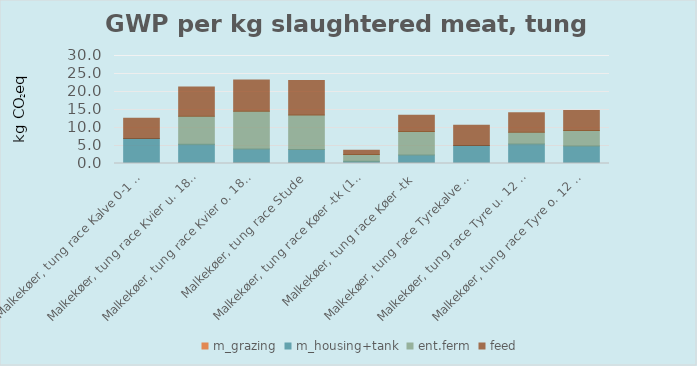
| Category | m_grazing | m_housing+tank | ent.ferm | feed |
|---|---|---|---|---|
| Malkekøer, tung race Kalve 0-1 mdr | 0 | 6.938 | 0 | 5.622 |
| Malkekøer, tung race Kvier u. 18. mdr. | 0.172 | 5.205 | 7.73 | 8.114 |
| Malkekøer, tung race Kvier o. 18. mdr. | 0.153 | 3.892 | 10.476 | 8.669 |
| Malkekøer, tung race Stude | 0.147 | 3.761 | 9.571 | 9.557 |
| Malkekøer, tung race Køer -tk (1year) | 0.014 | 0.631 | 1.823 | 1.22 |
| Malkekøer, tung race Køer -tk | 0.058 | 2.287 | 6.521 | 4.545 |
| Malkekøer, tung race Tyrekalve 0-1 mdr. | 0 | 4.997 | 0 | 5.622 |
| Malkekøer, tung race Tyre u. 12 mdr. | 0 | 5.433 | 3.281 | 5.397 |
| Malkekøer, tung race Tyre o. 12 mdr. | 0 | 4.884 | 4.287 | 5.528 |